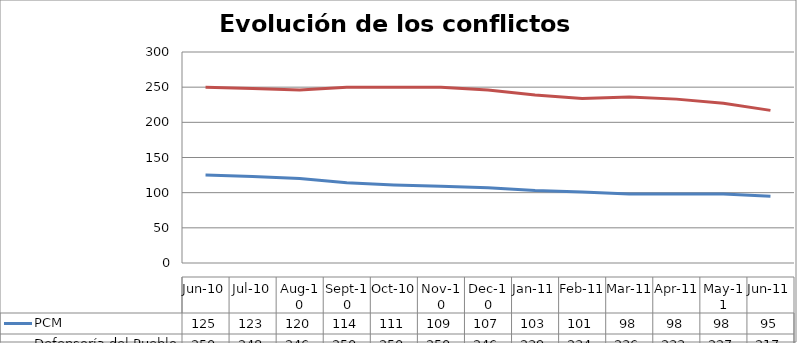
| Category | PCM | Defensoría del Pueblo |
|---|---|---|
| 2010-06-01 | 125 | 250 |
| 2010-07-01 | 123 | 248 |
| 2010-08-01 | 120 | 246 |
| 2010-09-01 | 114 | 250 |
| 2010-10-01 | 111 | 250 |
| 2010-11-01 | 109 | 250 |
| 2010-12-01 | 107 | 246 |
| 2011-01-01 | 103 | 239 |
| 2011-02-01 | 101 | 234 |
| 2011-03-01 | 98 | 236 |
| 2011-04-01 | 98 | 233 |
| 2011-05-01 | 98 | 227 |
| 2011-06-01 | 95 | 217 |